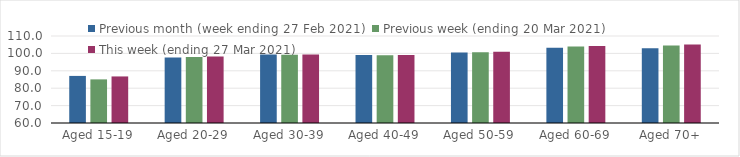
| Category | Previous month (week ending 27 Feb 2021) | Previous week (ending 20 Mar 2021) | This week (ending 27 Mar 2021) |
|---|---|---|---|
| Aged 15-19 | 87.06 | 85.07 | 86.76 |
| Aged 20-29 | 97.61 | 97.91 | 98.28 |
| Aged 30-39 | 99.37 | 99.24 | 99.38 |
| Aged 40-49 | 99.14 | 98.95 | 99.15 |
| Aged 50-59 | 100.57 | 100.71 | 100.99 |
| Aged 60-69 | 103.3 | 104.01 | 104.28 |
| Aged 70+ | 102.99 | 104.59 | 105.17 |